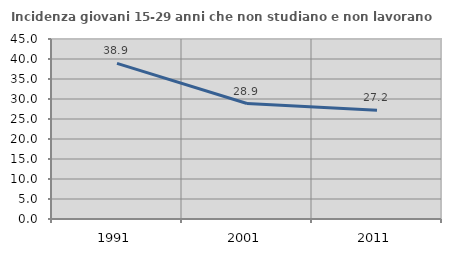
| Category | Incidenza giovani 15-29 anni che non studiano e non lavorano  |
|---|---|
| 1991.0 | 38.891 |
| 2001.0 | 28.866 |
| 2011.0 | 27.206 |